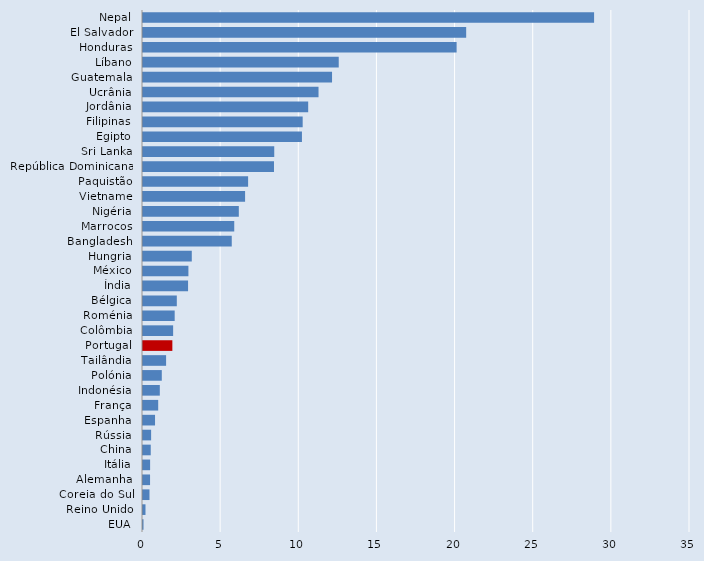
| Category | Series 0 |
|---|---|
| Nepal | 28.863 |
| El Salvador | 20.678 |
| Honduras | 20.067 |
| Líbano | 12.524 |
| Guatemala | 12.096 |
| Ucrânia | 11.231 |
| Jordânia | 10.57 |
| Filipinas | 10.217 |
| Egipto | 10.17 |
| Sri Lanka | 8.398 |
| República Dominicana | 8.382 |
| Paquistão | 6.726 |
| Vietname | 6.532 |
| Nigéria | 6.131 |
| Marrocos | 5.838 |
| Bangladesh | 5.679 |
| Hungria | 3.121 |
| México | 2.906 |
| Índia | 2.883 |
| Bélgica | 2.164 |
| Roménia | 2.027 |
| Colômbia | 1.928 |
| Portugal | 1.878 |
| Tailândia | 1.478 |
| Polónia | 1.202 |
| Indonésia | 1.076 |
| França | 0.972 |
| Espanha | 0.77 |
| Rússia | 0.519 |
| China | 0.495 |
| Itália | 0.455 |
| Alemanha | 0.451 |
| Coreia do Sul | 0.415 |
| Reino Unido | 0.159 |
| EUA | 0.033 |